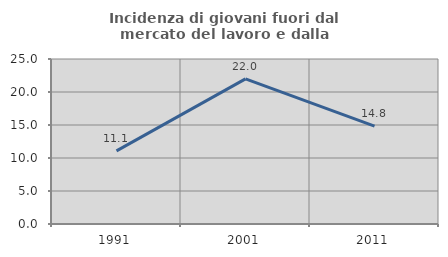
| Category | Incidenza di giovani fuori dal mercato del lavoro e dalla formazione  |
|---|---|
| 1991.0 | 11.076 |
| 2001.0 | 21.994 |
| 2011.0 | 14.843 |